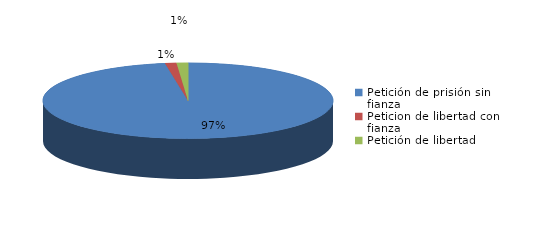
| Category | Series 0 |
|---|---|
| Petición de prisión sin fianza | 77 |
| Peticion de libertad con fianza | 1 |
| Petición de libertad | 1 |